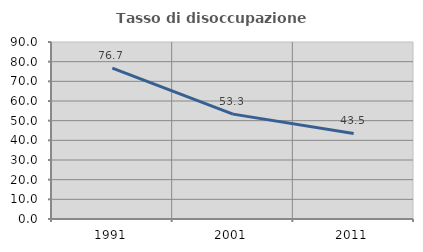
| Category | Tasso di disoccupazione giovanile  |
|---|---|
| 1991.0 | 76.744 |
| 2001.0 | 53.333 |
| 2011.0 | 43.478 |